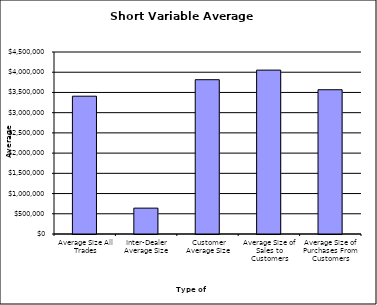
| Category | Security Type |
|---|---|
| Average Size All Trades | 3407070.867 |
| Inter-Dealer Average Size | 639626.575 |
| Customer Average Size | 3815348.791 |
| Average Size of Sales to Customers | 4051865.23 |
| Average Size of Purchases From Customers | 3567237.093 |